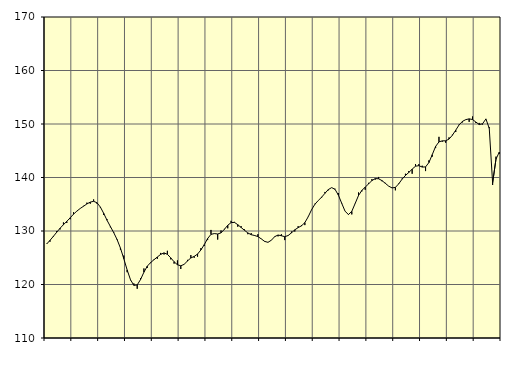
| Category | Piggar | Samtliga sysselsatta (inkl. sysselsatta utomlands) |
|---|---|---|
| nan | 127.6 | 127.57 |
| 87.0 | 128 | 128.26 |
| 87.0 | 128.9 | 129 |
| 87.0 | 130 | 129.78 |
| nan | 130.3 | 130.52 |
| 88.0 | 131.6 | 131.18 |
| 88.0 | 131.5 | 131.8 |
| 88.0 | 132.2 | 132.46 |
| nan | 133.5 | 133.14 |
| 89.0 | 133.7 | 133.72 |
| 89.0 | 134.2 | 134.21 |
| 89.0 | 134.7 | 134.63 |
| nan | 135.3 | 135.06 |
| 90.0 | 135.1 | 135.4 |
| 90.0 | 135.9 | 135.55 |
| 90.0 | 135.1 | 135.28 |
| nan | 134.4 | 134.49 |
| 91.0 | 133 | 133.31 |
| 91.0 | 132.2 | 132.01 |
| 91.0 | 130.7 | 130.84 |
| nan | 129.8 | 129.69 |
| 92.0 | 128.5 | 128.4 |
| 92.0 | 126.5 | 126.81 |
| 92.0 | 125.4 | 124.83 |
| nan | 122.3 | 122.72 |
| 93.0 | 120.8 | 120.89 |
| 93.0 | 120.2 | 119.84 |
| 93.0 | 119.2 | 119.92 |
| nan | 121.2 | 120.93 |
| 94.0 | 123 | 122.3 |
| 94.0 | 123.1 | 123.42 |
| 94.0 | 124 | 124.1 |
| nan | 124.7 | 124.63 |
| 95.0 | 124.8 | 125.14 |
| 95.0 | 125.9 | 125.63 |
| 95.0 | 125.6 | 125.91 |
| nan | 126.3 | 125.64 |
| 96.0 | 124.7 | 124.98 |
| 96.0 | 123.9 | 124.25 |
| 96.0 | 124.5 | 123.69 |
| nan | 122.9 | 123.5 |
| 97.0 | 123.8 | 123.76 |
| 97.0 | 124.6 | 124.41 |
| 97.0 | 125.5 | 124.96 |
| nan | 125 | 125.25 |
| 98.0 | 125.2 | 125.69 |
| 98.0 | 126.8 | 126.46 |
| 98.0 | 127.2 | 127.45 |
| nan | 128.3 | 128.59 |
| 99.0 | 130.2 | 129.37 |
| 99.0 | 129.5 | 129.52 |
| 99.0 | 128.4 | 129.44 |
| nan | 130.1 | 129.65 |
| 0.0 | 130.4 | 130.31 |
| 0.0 | 130.5 | 131.07 |
| 0.0 | 131.9 | 131.57 |
| nan | 131.7 | 131.61 |
| 1.0 | 130.8 | 131.18 |
| 1.0 | 130.9 | 130.65 |
| 1.0 | 130.3 | 130.13 |
| nan | 129.4 | 129.64 |
| 2.0 | 129.6 | 129.31 |
| 2.0 | 129.1 | 129.16 |
| 2.0 | 129.4 | 128.96 |
| nan | 128.5 | 128.53 |
| 3.0 | 128 | 128.06 |
| 3.0 | 127.9 | 127.88 |
| 3.0 | 128.3 | 128.27 |
| nan | 129 | 128.94 |
| 4.0 | 129 | 129.25 |
| 4.0 | 129.4 | 129.11 |
| 4.0 | 128.3 | 128.94 |
| nan | 129.2 | 129.15 |
| 5.0 | 129.9 | 129.65 |
| 5.0 | 129.9 | 130.22 |
| 5.0 | 130.9 | 130.63 |
| nan | 131.1 | 130.97 |
| 6.0 | 131.1 | 131.57 |
| 6.0 | 132.7 | 132.66 |
| 6.0 | 134 | 133.97 |
| nan | 135.1 | 135 |
| 7.0 | 135.7 | 135.7 |
| 7.0 | 136.2 | 136.32 |
| 7.0 | 137.3 | 137.05 |
| nan | 137.6 | 137.75 |
| 8.0 | 138.1 | 138.11 |
| 8.0 | 137.9 | 137.79 |
| 8.0 | 137.1 | 136.7 |
| nan | 135.1 | 135.17 |
| 9.0 | 133.7 | 133.69 |
| 9.0 | 133 | 133.08 |
| 9.0 | 133.1 | 133.67 |
| nan | 135.1 | 135.14 |
| 10.0 | 137.2 | 136.63 |
| 10.0 | 137.4 | 137.59 |
| 10.0 | 137.7 | 138.2 |
| nan | 139 | 138.8 |
| 11.0 | 139.7 | 139.42 |
| 11.0 | 139.6 | 139.8 |
| 11.0 | 140.1 | 139.76 |
| nan | 139.3 | 139.42 |
| 12.0 | 139 | 138.91 |
| 12.0 | 138.4 | 138.39 |
| 12.0 | 138.1 | 138.05 |
| nan | 137.6 | 138.15 |
| 13.0 | 138.9 | 138.82 |
| 13.0 | 139.8 | 139.69 |
| 13.0 | 140.7 | 140.38 |
| nan | 141.2 | 140.94 |
| 14.0 | 140.7 | 141.56 |
| 14.0 | 142.5 | 142.11 |
| 14.0 | 142.5 | 142.21 |
| nan | 142.2 | 141.95 |
| 15.0 | 141.2 | 141.98 |
| 15.0 | 143.2 | 142.79 |
| 15.0 | 143.9 | 144.27 |
| nan | 145.5 | 145.81 |
| 16.0 | 147.6 | 146.66 |
| 16.0 | 146.7 | 146.85 |
| 16.0 | 146.5 | 146.86 |
| nan | 147.5 | 147.18 |
| 17.0 | 148 | 147.9 |
| 17.0 | 148.5 | 148.85 |
| 17.0 | 149.9 | 149.83 |
| nan | 150.3 | 150.49 |
| 18.0 | 150.8 | 150.82 |
| 18.0 | 150.4 | 150.96 |
| 18.0 | 151.4 | 150.84 |
| nan | 150.2 | 150.37 |
| 19.0 | 150.2 | 149.9 |
| 19.0 | 149.9 | 150.04 |
| 19.0 | 150.9 | 150.95 |
| nan | 149.4 | 149.19 |
| 20.0 | 138.6 | 138.98 |
| 20.0 | 143.9 | 143.44 |
| 20.0 | 144.4 | 144.76 |